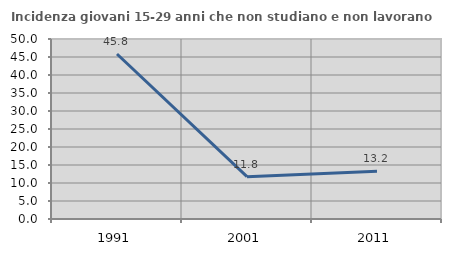
| Category | Incidenza giovani 15-29 anni che non studiano e non lavorano  |
|---|---|
| 1991.0 | 45.843 |
| 2001.0 | 11.765 |
| 2011.0 | 13.235 |